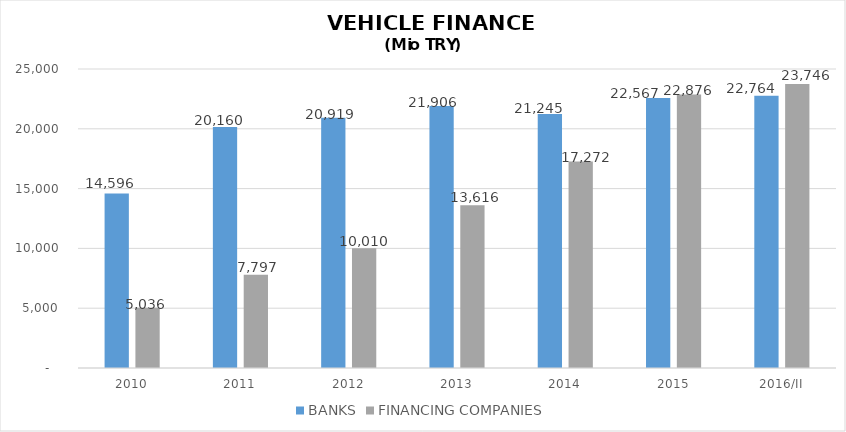
| Category | BANKS | FINANCING COMPANIES |
|---|---|---|
| 2010 | 14596 | 5035.89 |
| 2011 | 20160 | 7796.854 |
| 2012 | 20919 | 10009.755 |
| 2013 | 21906 | 13616.036 |
| 2014 | 21245 | 17271.844 |
| 2015 | 22567 | 22875.563 |
| 2016/II | 22764 | 23745.855 |